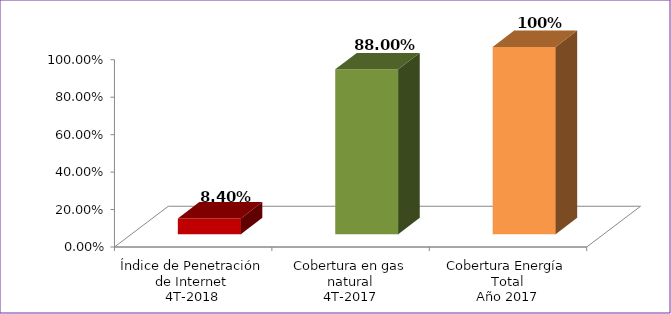
| Category | Series 0 |
|---|---|
| Índice de Penetración de Internet
4T-2018 | 0.084 |
| Cobertura en gas natural
4T-2017 | 0.88 |
| Cobertura Energía Total
Año 2017 | 1 |